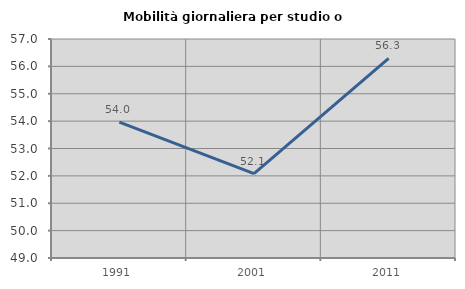
| Category | Mobilità giornaliera per studio o lavoro |
|---|---|
| 1991.0 | 53.96 |
| 2001.0 | 52.083 |
| 2011.0 | 56.294 |